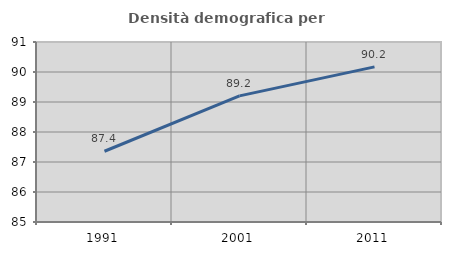
| Category | Densità demografica |
|---|---|
| 1991.0 | 87.359 |
| 2001.0 | 89.204 |
| 2011.0 | 90.171 |